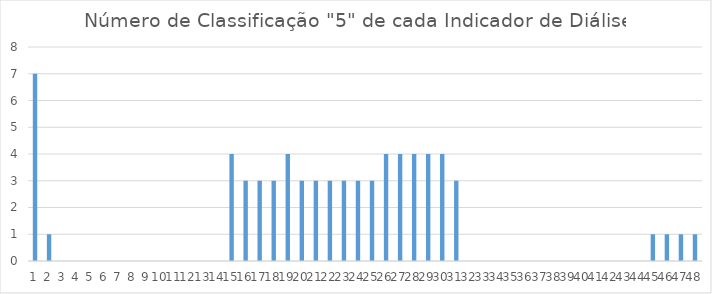
| Category | Series 0 |
|---|---|
| 0 | 7 |
| 1 | 1 |
| 2 | 0 |
| 3 | 0 |
| 4 | 0 |
| 5 | 0 |
| 6 | 0 |
| 7 | 0 |
| 8 | 0 |
| 9 | 0 |
| 10 | 0 |
| 11 | 0 |
| 12 | 0 |
| 13 | 0 |
| 14 | 4 |
| 15 | 3 |
| 16 | 3 |
| 17 | 3 |
| 18 | 4 |
| 19 | 3 |
| 20 | 3 |
| 21 | 3 |
| 22 | 3 |
| 23 | 3 |
| 24 | 3 |
| 25 | 4 |
| 26 | 4 |
| 27 | 4 |
| 28 | 4 |
| 29 | 4 |
| 30 | 3 |
| 31 | 0 |
| 32 | 0 |
| 33 | 0 |
| 34 | 0 |
| 35 | 0 |
| 36 | 0 |
| 37 | 0 |
| 38 | 0 |
| 39 | 0 |
| 40 | 0 |
| 41 | 0 |
| 42 | 0 |
| 43 | 0 |
| 44 | 1 |
| 45 | 1 |
| 46 | 1 |
| 47 | 1 |